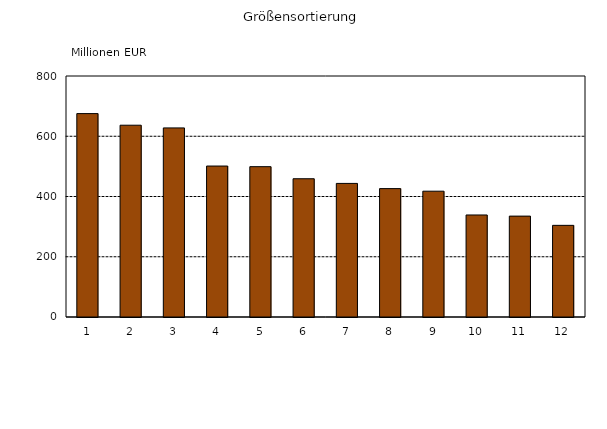
| Category | Series 0 |
|---|---|
| 1 | 675.159 |
| 2 | 636.632 |
| 3 | 627.646 |
| 4 | 501.11 |
| 5 | 499.018 |
| 6 | 458.966 |
| 7 | 443.45 |
| 8 | 426.162 |
| 9 | 417.588 |
| 10 | 338.676 |
| 11 | 334.88 |
| 12 | 304.237 |